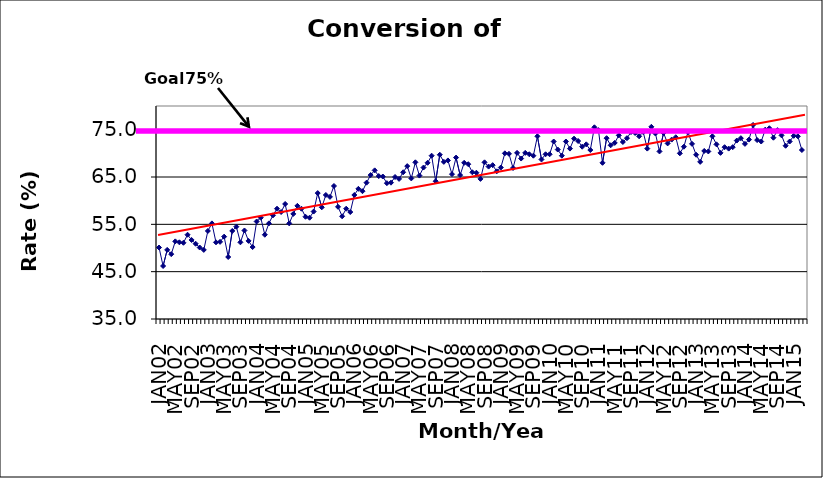
| Category | Series 0 |
|---|---|
| JAN02 | 50.1 |
| FEB02 | 46.2 |
| MAR02 | 49.6 |
| APR02 | 48.7 |
| MAY02 | 51.4 |
| JUN02 | 51.2 |
| JUL02 | 51.1 |
| AUG02 | 52.8 |
| SEP02 | 51.7 |
| OCT02 | 50.9 |
| NOV02 | 50.1 |
| DEC02 | 49.6 |
| JAN03 | 53.6 |
| FEB03 | 55.2 |
| MAR03 | 51.2 |
| APR03 | 51.3 |
| MAY03 | 52.4 |
| JUN03 | 48.1 |
| JUL03 | 53.6 |
| AUG03 | 54.5 |
| SEP03 | 51.2 |
| OCT03 | 53.7 |
| NOV03 | 51.5 |
| DEC03 | 50.2 |
| JAN04 | 55.6 |
| FEB04 | 56.4 |
| MAR04 | 52.8 |
| APR04 | 55.2 |
| MAY04 | 56.9 |
| JUN04 | 58.3 |
| JUL04 | 57.6 |
| AUG04 | 59.3 |
| SEP04 | 55.2 |
| OCT04 | 57.2 |
| NOV04 | 58.9 |
| DEC04 | 58.3 |
| JAN05 | 56.6 |
| FEB05 | 56.4 |
| MAR05 | 57.7 |
| APR05 | 61.6 |
| MAY05 | 58.6 |
| JUN05 | 61.2 |
| JUL05 | 60.8 |
| AUG05 | 63.1 |
| SEP05 | 58.7 |
| OCT05 | 56.7 |
| NOV05 | 58.3 |
| DEC05 | 57.6 |
| JAN06 | 61.2 |
| FEB06 | 62.5 |
| MAR06 | 62 |
| APR06 | 63.8 |
| MAY06 | 65.4 |
| JUN06 | 66.4 |
| JUL06 | 65.2 |
| AUG06 | 65.1 |
| SEP06 | 63.7 |
| OCT06 | 63.8 |
| NOV06 | 65 |
| DEC06 | 64.6 |
| JAN07 | 66 |
| FEB07 | 67.3 |
| MAR07 | 64.7 |
| APR07 | 68.1 |
| MAY07 | 65.3 |
| JUN07 | 67 |
| JUL07 | 68 |
| AUG07 | 69.5 |
| SEP07 | 64.1 |
| OCT07 | 69.7 |
| NOV07 | 68.2 |
| DEC07 | 68.5 |
| JAN08 | 65.6 |
| FEB08 | 69.1 |
| MAR08 | 65.4 |
| APR08 | 68 |
| MAY08 | 67.7 |
| JUN08 | 66 |
| JUL08 | 65.9 |
| AUG08 | 64.6 |
| SEP08 | 68.1 |
| OCT08 | 67.2 |
| NOV08 | 67.5 |
| DEC08 | 66.2 |
| JAN09 | 67 |
| FEB09 | 70 |
| MAR09 | 69.9 |
| APR09 | 66.9 |
| MAY09 | 70.1 |
| JUN09 | 68.9 |
| JUL09 | 70.1 |
| AUG09 | 69.8 |
| SEP09 | 69.5 |
| OCT09 | 73.6 |
| NOV09 | 68.7 |
| DEC09 | 69.8 |
| JAN10 | 69.8 |
| FEB10 | 72.5 |
| MAR10 | 70.8 |
| APR10 | 69.5 |
| MAY10 | 72.5 |
| JUN10 | 71 |
| JUL10 | 73.1 |
| AUG10 | 72.6 |
| SEP10 | 71.4 |
| OCT10 | 71.9 |
| NOV10 | 70.7 |
| DEC10 | 75.5 |
| JAN11 | 74.9 |
| FEB11 | 68 |
| MAR11 | 73.2 |
| APR11 | 71.7 |
| MAY11 | 72.2 |
| JUN11 | 73.8 |
| JUL11 | 72.4 |
| AUG11 | 73.2 |
| SEP11 | 74.5 |
| OCT11 | 74.3 |
| NOV11 | 73.6 |
| DEC11 | 74.5 |
| JAN12 | 71 |
| FEB12 | 75.6 |
| MAR12 | 74.2 |
| APR12 | 70.4 |
| MAY12 | 74.3 |
| JUN12 | 72.1 |
| JUL12 | 72.9 |
| AUG12 | 73.4 |
| SEP12 | 70 |
| OCT12 | 71.4 |
| NOV12 | 74.5 |
| DEC12 | 72 |
| JAN13 | 69.7 |
| FEB13 | 68.2 |
| MAR13 | 70.5 |
| APR13 | 70.4 |
| MAY13 | 73.6 |
| JUN13 | 71.9 |
| JUL13 | 70.1 |
| AUG13 | 71.3 |
| SEP13 | 71 |
| OCT13 | 71.3 |
| NOV13 | 72.7 |
| DEC13 | 73.2 |
| JAN14 | 72 |
| FEB14 | 72.9 |
| MAR14 | 76 |
| APR14 | 72.8 |
| MAY14 | 72.5 |
| JUN14 | 75 |
| JUL14 | 75.3 |
| AUG14 | 73.3 |
| SEP14 | 74.9 |
| OCT14 | 73.8 |
| NOV14 | 71.6 |
| DEC14 | 72.5 |
| JAN15 | 73.7 |
| FEB15 | 73.6 |
| MAR15 | 70.7 |